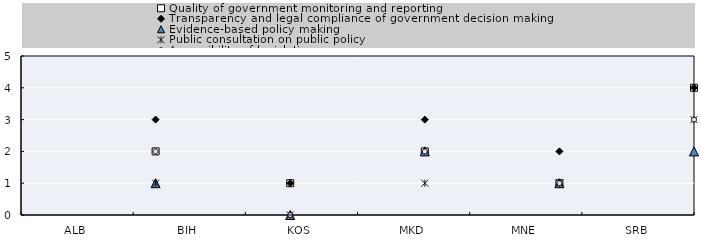
| Category | Series 7 |
|---|---|
| ALB | 0 |
| BIH | 0 |
| KOS | 0 |
| MKD | 0 |
| MNE | 0 |
| SRB | 0 |